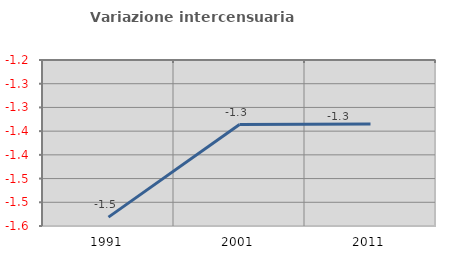
| Category | Variazione intercensuaria annua |
|---|---|
| 1991.0 | -1.531 |
| 2001.0 | -1.336 |
| 2011.0 | -1.335 |